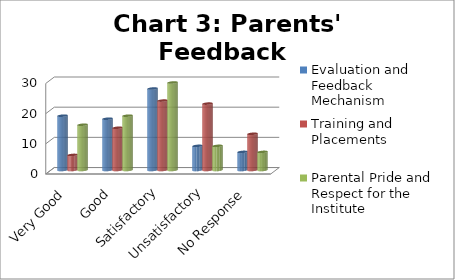
| Category | Evaluation and Feedback Mechanism | Training and Placements | Parental Pride and Respect for the Institute |
|---|---|---|---|
| Very Good | 18 | 5 | 15 |
| Good | 17 | 14 | 18 |
| Satisfactory | 27 | 23 | 29 |
| Unsatisfactory | 8 | 22 | 8 |
| No Response | 6 | 12 | 6 |